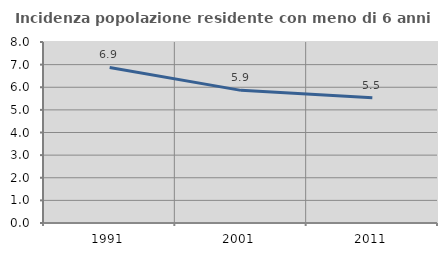
| Category | Incidenza popolazione residente con meno di 6 anni |
|---|---|
| 1991.0 | 6.874 |
| 2001.0 | 5.862 |
| 2011.0 | 5.535 |